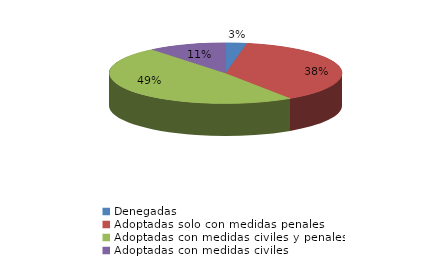
| Category | Series 0 |
|---|---|
| Denegadas | 39 |
| Adoptadas solo con medidas penales | 503 |
| Adoptadas con medidas civiles y penales | 647 |
| Adoptadas con medidas civiles | 144 |